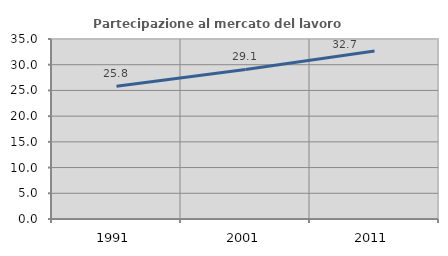
| Category | Partecipazione al mercato del lavoro  femminile |
|---|---|
| 1991.0 | 25.809 |
| 2001.0 | 29.084 |
| 2011.0 | 32.658 |